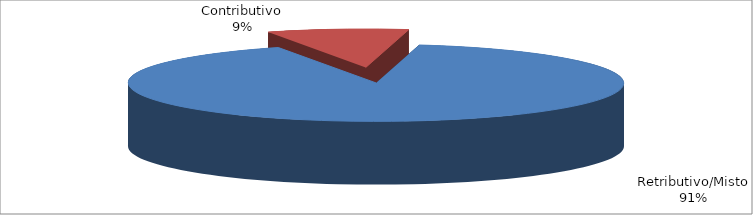
| Category | Decorrenti ANNO 2021 |
|---|---|
| Retributivo/Misto | 301350 |
| Contributivo | 30609 |